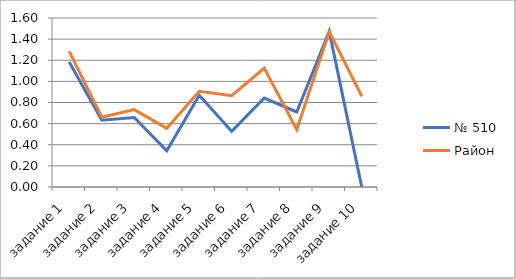
| Category | № 510 | Район |
|---|---|---|
| задание 1 | 1.184 | 1.284 |
| задание 2 | 0.632 | 0.661 |
| задание 3 | 0.658 | 0.733 |
| задание 4 | 0.342 | 0.555 |
| задание 5 | 0.868 | 0.906 |
| задание 6 | 0.526 | 0.865 |
| задание 7 | 0.842 | 1.127 |
| задание 8 | 0.711 | 0.543 |
| задание 9 | 1.474 | 1.472 |
| задание 10 | 0 | 0.859 |